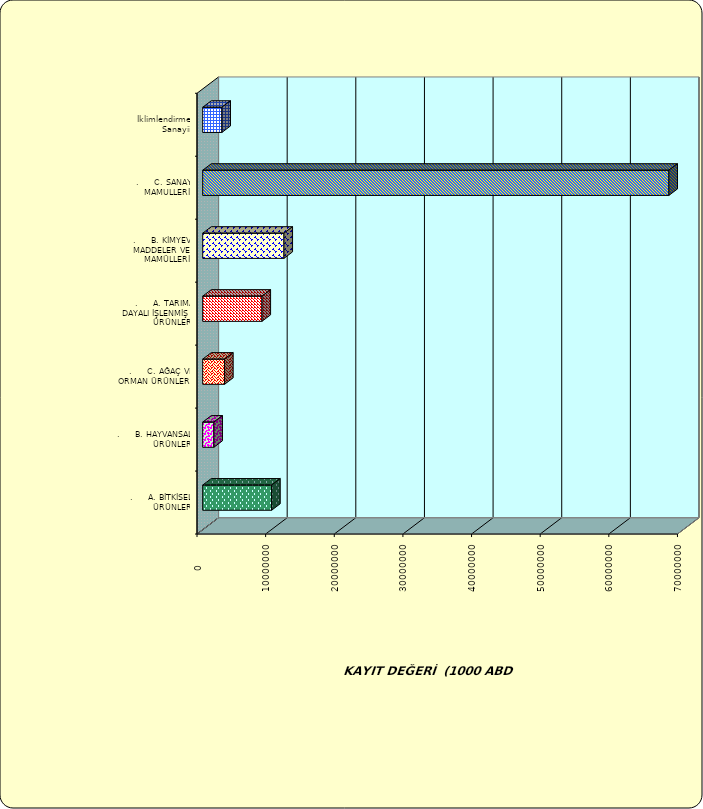
| Category | Series 0 |
|---|---|
| .     A. BİTKİSEL ÜRÜNLER | 10041031.825 |
| .     B. HAYVANSAL ÜRÜNLER | 1628062.753 |
| .     C. AĞAÇ VE ORMAN ÜRÜNLERİ | 3187314.818 |
| .     A. TARIMA DAYALI İŞLENMİŞ ÜRÜNLER | 8636099.468 |
| .     B. KİMYEVİ MADDELER VE MAMÜLLERİ | 11837987.576 |
| .     C. SANAYİ MAMULLERİ | 67919531.834 |
|  İklimlendirme Sanayii | 2795562.566 |